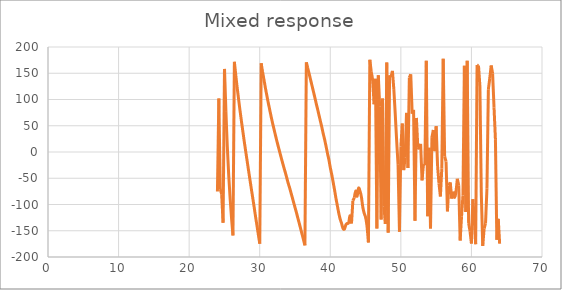
| Category | Series 1 |
|---|---|
| 24.01 | -75.169 |
| 24.20995 | 101.948 |
| 24.4099 | -70.43 |
| 24.60985 | -80.579 |
| 24.8098 | -134.649 |
| 25.00975 | 158.306 |
| 25.2097 | 77.784 |
| 25.40965 | 9.516 |
| 25.6096 | -44.796 |
| 25.80955 | -88.809 |
| 26.0095 | -126.266 |
| 26.20945 | -158.972 |
| 26.4094 | 171.735 |
| 26.60935 | 146.421 |
| 26.8093 | 122.249 |
| 27.00925 | 100.302 |
| 27.2092 | 78.877 |
| 27.40915 | 58.861 |
| 27.6091 | 39.356 |
| 27.80905 | 20.049 |
| 28.009 | 1.8 |
| 28.20895 | -16.251 |
| 28.4089 | -34.223 |
| 28.60885 | -52.158 |
| 28.808799999999998 | -69.921 |
| 29.00875 | -87.151 |
| 29.2087 | -104.777 |
| 29.40865 | -122.88 |
| 29.6086 | -140.101 |
| 29.80855 | -157.591 |
| 30.008499999999998 | -174.622 |
| 30.20845 | 169.105 |
| 30.4084 | 152.353 |
| 30.60835 | 137.323 |
| 30.8083 | 121.834 |
| 31.00825 | 107.657 |
| 31.208199999999998 | 93.957 |
| 31.40815 | 80.986 |
| 31.6081 | 68.044 |
| 31.80805 | 55.735 |
| 32.007999999999996 | 44.467 |
| 32.20795 | 33.079 |
| 32.4079 | 22.021 |
| 32.60785 | 11.641 |
| 32.8078 | 1.257 |
| 33.00775 | -8.919 |
| 33.2077 | -18.989 |
| 33.407650000000004 | -28.754 |
| 33.6076 | -38.073 |
| 33.80755 | -47.805 |
| 34.0075 | -58.156 |
| 34.20745 | -66.922 |
| 34.4074 | -76.525 |
| 34.60735 | -86.233 |
| 34.8073 | -96.168 |
| 35.00725 | -105.925 |
| 35.2072 | -115.559 |
| 35.40715 | -125.966 |
| 35.6071 | -136.059 |
| 35.807050000000004 | -146.472 |
| 36.007 | -156.874 |
| 36.20695 | -167.329 |
| 36.4069 | -177.845 |
| 36.60685 | 170.76 |
| 36.8068 | 159.918 |
| 37.00675 | 149.038 |
| 37.2067 | 137.717 |
| 37.40665 | 126.603 |
| 37.6066 | 115.363 |
| 37.80655 | 104.161 |
| 38.0065 | 92.317 |
| 38.206450000000004 | 81.318 |
| 38.4064 | 69.835 |
| 38.60635 | 58.293 |
| 38.8063 | 46.955 |
| 39.00625 | 34.525 |
| 39.2062 | 23.282 |
| 39.40615 | 10.515 |
| 39.6061 | -2.957 |
| 39.80605 | -14.964 |
| 40.006 | -30.083 |
| 40.20595 | -42.918 |
| 40.4059 | -57.417 |
| 40.605850000000004 | -72.372 |
| 40.805800000000005 | -88.347 |
| 41.00575 | -102.579 |
| 41.2057 | -116.837 |
| 41.40565 | -128.112 |
| 41.605599999999995 | -136.37 |
| 41.80555 | -145.779 |
| 42.0055 | -146.702 |
| 42.20545 | -138.711 |
| 42.4054 | -136.02 |
| 42.60535 | -134.716 |
| 42.8053 | -121.333 |
| 43.005250000000004 | -136.124 |
| 43.205200000000005 | -92.446 |
| 43.40515 | -86.969 |
| 43.6051 | -74.136 |
| 43.80505 | -84.382 |
| 44.004999999999995 | -68.787 |
| 44.20495 | -74.247 |
| 44.4049 | -85.189 |
| 44.60485 | -104.761 |
| 44.8048 | -116.702 |
| 45.00475 | -124.47 |
| 45.2047 | -141.509 |
| 45.404650000000004 | -172.284 |
| 45.604600000000005 | 175.716 |
| 45.80455 | 152.621 |
| 46.0045 | 135.643 |
| 46.20445 | 90.979 |
| 46.404399999999995 | 139.613 |
| 46.60435 | -145.886 |
| 46.8043 | 146.171 |
| 47.00425 | 87.138 |
| 47.2042 | -128.442 |
| 47.40415 | 101.741 |
| 47.6041 | -103.171 |
| 47.804050000000004 | -137.142 |
| 48.004000000000005 | 170.621 |
| 48.20395 | -153.559 |
| 48.4039 | 146.002 |
| 48.60385 | 142.311 |
| 48.803799999999995 | 154.51 |
| 49.00375 | 119.669 |
| 49.2037 | 72.466 |
| 49.40365 | 21.941 |
| 49.6036 | -24.643 |
| 49.80355 | -152.067 |
| 50.0035 | 10.258 |
| 50.203450000000004 | 54.205 |
| 50.403400000000005 | -34.576 |
| 50.60335 | -10.806 |
| 50.8033 | 74.548 |
| 51.00325 | -30.436 |
| 51.203199999999995 | 141.813 |
| 51.40315 | 148.012 |
| 51.6031 | 72.932 |
| 51.80305 | 80.249 |
| 52.003 | -130.994 |
| 52.20295 | 64.947 |
| 52.4029 | 9.583 |
| 52.602850000000004 | 5.224 |
| 52.802800000000005 | 15.433 |
| 53.00275 | -54.107 |
| 53.2027 | -23.419 |
| 53.40265 | -25.194 |
| 53.602599999999995 | 173.648 |
| 53.80255 | -122.295 |
| 54.0025 | 7.995 |
| 54.20245 | -145.853 |
| 54.4024 | 28.311 |
| 54.60235 | 42.03 |
| 54.8023 | 1.643 |
| 55.002250000000004 | 49.232 |
| 55.202200000000005 | -26.83 |
| 55.40215 | -60.003 |
| 55.6021 | -84.722 |
| 55.80205 | -31.656 |
| 56.002 | 177.691 |
| 56.20195 | -8.175 |
| 56.4019 | -18.097 |
| 56.60185 | -113.109 |
| 56.8018 | -63.636 |
| 57.00175 | -57.859 |
| 57.2017 | -88.776 |
| 57.40165 | -75.396 |
| 57.6016 | -86.596 |
| 57.80155 | -76.246 |
| 58.0015 | -50.96 |
| 58.20145 | -63.411 |
| 58.4014 | -168.692 |
| 58.60135 | -122.45 |
| 58.8013 | -82.559 |
| 59.00125 | 164.113 |
| 59.2012 | -114.223 |
| 59.40115 | 173.702 |
| 59.6011 | -135.395 |
| 59.80105 | -151.014 |
| 60.001 | -174.394 |
| 60.20095 | -89.874 |
| 60.4009 | -127.498 |
| 60.60085 | -175.518 |
| 60.8008 | 165.569 |
| 61.00075 | 164.803 |
| 61.2007 | 125.755 |
| 61.40065 | -80.062 |
| 61.6006 | -178.937 |
| 61.80055 | -145.947 |
| 62.0005 | -135.759 |
| 62.20045 | -68.982 |
| 62.4004 | 119.351 |
| 62.60035 | 140.753 |
| 62.8003 | 164.854 |
| 63.00025 | 150.025 |
| 63.2002 | 85.318 |
| 63.40015 | 24.484 |
| 63.6001 | -167.309 |
| 63.80005 | -127.286 |
| 64.0 | -174.635 |
| 64.0 | -174.635 |
| 64.0 | -174.635 |
| 64.0 | -174.635 |
| 64.0 | -174.635 |
| 64.0 | -174.635 |
| 64.0 | -174.635 |
| 64.0 | -174.635 |
| 64.0 | -174.635 |
| 64.0 | -174.635 |
| 64.0 | -174.635 |
| 64.0 | -174.635 |
| 64.0 | -174.635 |
| 64.0 | -174.635 |
| 64.0 | -174.635 |
| 64.0 | -174.635 |
| 64.0 | -174.635 |
| 64.0 | -174.635 |
| 64.0 | -174.635 |
| 64.0 | -174.635 |
| 64.0 | -174.635 |
| 64.0 | -174.635 |
| 64.0 | -174.635 |
| 64.0 | -174.635 |
| 64.0 | -174.635 |
| 64.0 | -174.635 |
| 64.0 | -174.635 |
| 64.0 | -174.635 |
| 64.0 | -174.635 |
| 64.0 | -174.635 |
| 64.0 | -174.635 |
| 64.0 | -174.635 |
| 64.0 | -174.635 |
| 64.0 | -174.635 |
| 64.0 | -174.635 |
| 64.0 | -174.635 |
| 64.0 | -174.635 |
| 64.0 | -174.635 |
| 64.0 | -174.635 |
| 64.0 | -174.635 |
| 64.0 | -174.635 |
| 64.0 | -174.635 |
| 64.0 | -174.635 |
| 64.0 | -174.635 |
| 64.0 | -174.635 |
| 64.0 | -174.635 |
| 64.0 | -174.635 |
| 64.0 | -174.635 |
| 64.0 | -174.635 |
| 64.0 | -174.635 |
| 64.0 | -174.635 |
| 64.0 | -174.635 |
| 64.0 | -174.635 |
| 64.0 | -174.635 |
| 64.0 | -174.635 |
| 64.0 | -174.635 |
| 64.0 | -174.635 |
| 64.0 | -174.635 |
| 64.0 | -174.635 |
| 64.0 | -174.635 |
| 64.0 | -174.635 |
| 64.0 | -174.635 |
| 64.0 | -174.635 |
| 64.0 | -174.635 |
| 64.0 | -174.635 |
| 64.0 | -174.635 |
| 64.0 | -174.635 |
| 64.0 | -174.635 |
| 64.0 | -174.635 |
| 64.0 | -174.635 |
| 64.0 | -174.635 |
| 64.0 | -174.635 |
| 64.0 | -174.635 |
| 64.0 | -174.635 |
| 64.0 | -174.635 |
| 64.0 | -174.635 |
| 64.0 | -174.635 |
| 64.0 | -174.635 |
| 64.0 | -174.635 |
| 64.0 | -174.635 |
| 64.0 | -174.635 |
| 64.0 | -174.635 |
| 64.0 | -174.635 |
| 64.0 | -174.635 |
| 64.0 | -174.635 |
| 64.0 | -174.635 |
| 64.0 | -174.635 |
| 64.0 | -174.635 |
| 64.0 | -174.635 |
| 64.0 | -174.635 |
| 64.0 | -174.635 |
| 64.0 | -174.635 |
| 64.0 | -174.635 |
| 64.0 | -174.635 |
| 64.0 | -174.635 |
| 64.0 | -174.635 |
| 64.0 | -174.635 |
| 64.0 | -174.635 |
| 64.0 | -174.635 |
| 64.0 | -174.635 |
| 64.0 | -174.635 |
| 64.0 | -174.635 |
| 64.0 | -174.635 |
| 64.0 | -174.635 |
| 64.0 | -174.635 |
| 64.0 | -174.635 |
| 64.0 | -174.635 |
| 64.0 | -174.635 |
| 64.0 | -174.635 |
| 64.0 | -174.635 |
| 64.0 | -174.635 |
| 64.0 | -174.635 |
| 64.0 | -174.635 |
| 64.0 | -174.635 |
| 64.0 | -174.635 |
| 64.0 | -174.635 |
| 64.0 | -174.635 |
| 64.0 | -174.635 |
| 64.0 | -174.635 |
| 64.0 | -174.635 |
| 64.0 | -174.635 |
| 64.0 | -174.635 |
| 64.0 | -174.635 |
| 64.0 | -174.635 |
| 64.0 | -174.635 |
| 64.0 | -174.635 |
| 64.0 | -174.635 |
| 64.0 | -174.635 |
| 64.0 | -174.635 |
| 64.0 | -174.635 |
| 64.0 | -174.635 |
| 64.0 | -174.635 |
| 64.0 | -174.635 |
| 64.0 | -174.635 |
| 64.0 | -174.635 |
| 64.0 | -174.635 |
| 64.0 | -174.635 |
| 64.0 | -174.635 |
| 64.0 | -174.635 |
| 64.0 | -174.635 |
| 64.0 | -174.635 |
| 64.0 | -174.635 |
| 64.0 | -174.635 |
| 64.0 | -174.635 |
| 64.0 | -174.635 |
| 64.0 | -174.635 |
| 64.0 | -174.635 |
| 64.0 | -174.635 |
| 64.0 | -174.635 |
| 64.0 | -174.635 |
| 64.0 | -174.635 |
| 64.0 | -174.635 |
| 64.0 | -174.635 |
| 64.0 | -174.635 |
| 64.0 | -174.635 |
| 64.0 | -174.635 |
| 64.0 | -174.635 |
| 64.0 | -174.635 |
| 64.0 | -174.635 |
| 64.0 | -174.635 |
| 64.0 | -174.635 |
| 64.0 | -174.635 |
| 64.0 | -174.635 |
| 64.0 | -174.635 |
| 64.0 | -174.635 |
| 64.0 | -174.635 |
| 64.0 | -174.635 |
| 64.0 | -174.635 |
| 64.0 | -174.635 |
| 64.0 | -174.635 |
| 64.0 | -174.635 |
| 64.0 | -174.635 |
| 64.0 | -174.635 |
| 64.0 | -174.635 |
| 64.0 | -174.635 |
| 64.0 | -174.635 |
| 64.0 | -174.635 |
| 64.0 | -174.635 |
| 64.0 | -174.635 |
| 64.0 | -174.635 |
| 64.0 | -174.635 |
| 64.0 | -174.635 |
| 64.0 | -174.635 |
| 64.0 | -174.635 |
| 64.0 | -174.635 |
| 64.0 | -174.635 |
| 64.0 | -174.635 |
| 64.0 | -174.635 |
| 64.0 | -174.635 |
| 64.0 | -174.635 |
| 64.0 | -174.635 |
| 64.0 | -174.635 |
| 64.0 | -174.635 |
| 64.0 | -174.635 |
| 64.0 | -174.635 |
| 64.0 | -174.635 |
| 64.0 | -174.635 |
| 64.0 | -174.635 |
| 64.0 | -174.635 |
| 64.0 | -174.635 |
| 64.0 | -174.635 |
| 64.0 | -174.635 |
| 64.0 | -174.635 |
| 64.0 | -174.635 |
| 64.0 | -174.635 |
| 64.0 | -174.635 |
| 64.0 | -174.635 |
| 64.0 | -174.635 |
| 64.0 | -174.635 |
| 64.0 | -174.635 |
| 64.0 | -174.635 |
| 64.0 | -174.635 |
| 64.0 | -174.635 |
| 64.0 | -174.635 |
| 64.0 | -174.635 |
| 64.0 | -174.635 |
| 64.0 | -174.635 |
| 64.0 | -174.635 |
| 64.0 | -174.635 |
| 64.0 | -174.635 |
| 64.0 | -174.635 |
| 64.0 | -174.635 |
| 64.0 | -174.635 |
| 64.0 | -174.635 |
| 64.0 | -174.635 |
| 64.0 | -174.635 |
| 64.0 | -174.635 |
| 64.0 | -174.635 |
| 64.0 | -174.635 |
| 64.0 | -174.635 |
| 64.0 | -174.635 |
| 64.0 | -174.635 |
| 64.0 | -174.635 |
| 64.0 | -174.635 |
| 64.0 | -174.635 |
| 64.0 | -174.635 |
| 64.0 | -174.635 |
| 64.0 | -174.635 |
| 64.0 | -174.635 |
| 64.0 | -174.635 |
| 64.0 | -174.635 |
| 64.0 | -174.635 |
| 64.0 | -174.635 |
| 64.0 | -174.635 |
| 64.0 | -174.635 |
| 64.0 | -174.635 |
| 64.0 | -174.635 |
| 64.0 | -174.635 |
| 64.0 | -174.635 |
| 64.0 | -174.635 |
| 64.0 | -174.635 |
| 64.0 | -174.635 |
| 64.0 | -174.635 |
| 64.0 | -174.635 |
| 64.0 | -174.635 |
| 64.0 | -174.635 |
| 64.0 | -174.635 |
| 64.0 | -174.635 |
| 64.0 | -174.635 |
| 64.0 | -174.635 |
| 64.0 | -174.635 |
| 64.0 | -174.635 |
| 64.0 | -174.635 |
| 64.0 | -174.635 |
| 64.0 | -174.635 |
| 64.0 | -174.635 |
| 64.0 | -174.635 |
| 64.0 | -174.635 |
| 64.0 | -174.635 |
| 64.0 | -174.635 |
| 64.0 | -174.635 |
| 64.0 | -174.635 |
| 64.0 | -174.635 |
| 64.0 | -174.635 |
| 64.0 | -174.635 |
| 64.0 | -174.635 |
| 64.0 | -174.635 |
| 64.0 | -174.635 |
| 64.0 | -174.635 |
| 64.0 | -174.635 |
| 64.0 | -174.635 |
| 64.0 | -174.635 |
| 64.0 | -174.635 |
| 64.0 | -174.635 |
| 64.0 | -174.635 |
| 64.0 | -174.635 |
| 64.0 | -174.635 |
| 64.0 | -174.635 |
| 64.0 | -174.635 |
| 64.0 | -174.635 |
| 64.0 | -174.635 |
| 64.0 | -174.635 |
| 64.0 | -174.635 |
| 64.0 | -174.635 |
| 64.0 | -174.635 |
| 64.0 | -174.635 |
| 64.0 | -174.635 |
| 64.0 | -174.635 |
| 64.0 | -174.635 |
| 64.0 | -174.635 |
| 64.0 | -174.635 |
| 64.0 | -174.635 |
| 64.0 | -174.635 |
| 64.0 | -174.635 |
| 64.0 | -174.635 |
| 64.0 | -174.635 |
| 64.0 | -174.635 |
| 64.0 | -174.635 |
| 64.0 | -174.635 |
| 64.0 | -174.635 |
| 64.0 | -174.635 |
| 64.0 | -174.635 |
| 64.0 | -174.635 |
| 64.0 | -174.635 |
| 64.0 | -174.635 |
| 64.0 | -174.635 |
| 64.0 | -174.635 |
| 64.0 | -174.635 |
| 64.0 | -174.635 |
| 64.0 | -174.635 |
| 64.0 | -174.635 |
| 64.0 | -174.635 |
| 64.0 | -174.635 |
| 64.0 | -174.635 |
| 64.0 | -174.635 |
| 64.0 | -174.635 |
| 64.0 | -174.635 |
| 64.0 | -174.635 |
| 64.0 | -174.635 |
| 64.0 | -174.635 |
| 64.0 | -174.635 |
| 64.0 | -174.635 |
| 64.0 | -174.635 |
| 64.0 | -174.635 |
| 64.0 | -174.635 |
| 64.0 | -174.635 |
| 64.0 | -174.635 |
| 64.0 | -174.635 |
| 64.0 | -174.635 |
| 64.0 | -174.635 |
| 64.0 | -174.635 |
| 64.0 | -174.635 |
| 64.0 | -174.635 |
| 64.0 | -174.635 |
| 64.0 | -174.635 |
| 64.0 | -174.635 |
| 64.0 | -174.635 |
| 64.0 | -174.635 |
| 64.0 | -174.635 |
| 64.0 | -174.635 |
| 64.0 | -174.635 |
| 64.0 | -174.635 |
| 64.0 | -174.635 |
| 64.0 | -174.635 |
| 64.0 | -174.635 |
| 64.0 | -174.635 |
| 64.0 | -174.635 |
| 64.0 | -174.635 |
| 64.0 | -174.635 |
| 64.0 | -174.635 |
| 64.0 | -174.635 |
| 64.0 | -174.635 |
| 64.0 | -174.635 |
| 64.0 | -174.635 |
| 64.0 | -174.635 |
| 64.0 | -174.635 |
| 64.0 | -174.635 |
| 64.0 | -174.635 |
| 64.0 | -174.635 |
| 64.0 | -174.635 |
| 64.0 | -174.635 |
| 64.0 | -174.635 |
| 64.0 | -174.635 |
| 64.0 | -174.635 |
| 64.0 | -174.635 |
| 64.0 | -174.635 |
| 64.0 | -174.635 |
| 64.0 | -174.635 |
| 64.0 | -174.635 |
| 64.0 | -174.635 |
| 64.0 | -174.635 |
| 64.0 | -174.635 |
| 64.0 | -174.635 |
| 64.0 | -174.635 |
| 64.0 | -174.635 |
| 64.0 | -174.635 |
| 64.0 | -174.635 |
| 64.0 | -174.635 |
| 64.0 | -174.635 |
| 64.0 | -174.635 |
| 64.0 | -174.635 |
| 64.0 | -174.635 |
| 64.0 | -174.635 |
| 64.0 | -174.635 |
| 64.0 | -174.635 |
| 64.0 | -174.635 |
| 64.0 | -174.635 |
| 64.0 | -174.635 |
| 64.0 | -174.635 |
| 64.0 | -174.635 |
| 64.0 | -174.635 |
| 64.0 | -174.635 |
| 64.0 | -174.635 |
| 64.0 | -174.635 |
| 64.0 | -174.635 |
| 64.0 | -174.635 |
| 64.0 | -174.635 |
| 64.0 | -174.635 |
| 64.0 | -174.635 |
| 64.0 | -174.635 |
| 64.0 | -174.635 |
| 64.0 | -174.635 |
| 64.0 | -174.635 |
| 64.0 | -174.635 |
| 64.0 | -174.635 |
| 64.0 | -174.635 |
| 64.0 | -174.635 |
| 64.0 | -174.635 |
| 64.0 | -174.635 |
| 64.0 | -174.635 |
| 64.0 | -174.635 |
| 64.0 | -174.635 |
| 64.0 | -174.635 |
| 64.0 | -174.635 |
| 64.0 | -174.635 |
| 64.0 | -174.635 |
| 64.0 | -174.635 |
| 64.0 | -174.635 |
| 64.0 | -174.635 |
| 64.0 | -174.635 |
| 64.0 | -174.635 |
| 64.0 | -174.635 |
| 64.0 | -174.635 |
| 64.0 | -174.635 |
| 64.0 | -174.635 |
| 64.0 | -174.635 |
| 64.0 | -174.635 |
| 64.0 | -174.635 |
| 64.0 | -174.635 |
| 64.0 | -174.635 |
| 64.0 | -174.635 |
| 64.0 | -174.635 |
| 64.0 | -174.635 |
| 64.0 | -174.635 |
| 64.0 | -174.635 |
| 64.0 | -174.635 |
| 64.0 | -174.635 |
| 64.0 | -174.635 |
| 64.0 | -174.635 |
| 64.0 | -174.635 |
| 64.0 | -174.635 |
| 64.0 | -174.635 |
| 64.0 | -174.635 |
| 64.0 | -174.635 |
| 64.0 | -174.635 |
| 64.0 | -174.635 |
| 64.0 | -174.635 |
| 64.0 | -174.635 |
| 64.0 | -174.635 |
| 64.0 | -174.635 |
| 64.0 | -174.635 |
| 64.0 | -174.635 |
| 64.0 | -174.635 |
| 64.0 | -174.635 |
| 64.0 | -174.635 |
| 64.0 | -174.635 |
| 64.0 | -174.635 |
| 64.0 | -174.635 |
| 64.0 | -174.635 |
| 64.0 | -174.635 |
| 64.0 | -174.635 |
| 64.0 | -174.635 |
| 64.0 | -174.635 |
| 64.0 | -174.635 |
| 64.0 | -174.635 |
| 64.0 | -174.635 |
| 64.0 | -174.635 |
| 64.0 | -174.635 |
| 64.0 | -174.635 |
| 64.0 | -174.635 |
| 64.0 | -174.635 |
| 64.0 | -174.635 |
| 64.0 | -174.635 |
| 64.0 | -174.635 |
| 64.0 | -174.635 |
| 64.0 | -174.635 |
| 64.0 | -174.635 |
| 64.0 | -174.635 |
| 64.0 | -174.635 |
| 64.0 | -174.635 |
| 64.0 | -174.635 |
| 64.0 | -174.635 |
| 64.0 | -174.635 |
| 64.0 | -174.635 |
| 64.0 | -174.635 |
| 64.0 | -174.635 |
| 64.0 | -174.635 |
| 64.0 | -174.635 |
| 64.0 | -174.635 |
| 64.0 | -174.635 |
| 64.0 | -174.635 |
| 64.0 | -174.635 |
| 64.0 | -174.635 |
| 64.0 | -174.635 |
| 64.0 | -174.635 |
| 64.0 | -174.635 |
| 64.0 | -174.635 |
| 64.0 | -174.635 |
| 64.0 | -174.635 |
| 64.0 | -174.635 |
| 64.0 | -174.635 |
| 64.0 | -174.635 |
| 64.0 | -174.635 |
| 64.0 | -174.635 |
| 64.0 | -174.635 |
| 64.0 | -174.635 |
| 64.0 | -174.635 |
| 64.0 | -174.635 |
| 64.0 | -174.635 |
| 64.0 | -174.635 |
| 64.0 | -174.635 |
| 64.0 | -174.635 |
| 64.0 | -174.635 |
| 64.0 | -174.635 |
| 64.0 | -174.635 |
| 64.0 | -174.635 |
| 64.0 | -174.635 |
| 64.0 | -174.635 |
| 64.0 | -174.635 |
| 64.0 | -174.635 |
| 64.0 | -174.635 |
| 64.0 | -174.635 |
| 64.0 | -174.635 |
| 64.0 | -174.635 |
| 64.0 | -174.635 |
| 64.0 | -174.635 |
| 64.0 | -174.635 |
| 64.0 | -174.635 |
| 64.0 | -174.635 |
| 64.0 | -174.635 |
| 64.0 | -174.635 |
| 64.0 | -174.635 |
| 64.0 | -174.635 |
| 64.0 | -174.635 |
| 64.0 | -174.635 |
| 64.0 | -174.635 |
| 64.0 | -174.635 |
| 64.0 | -174.635 |
| 64.0 | -174.635 |
| 64.0 | -174.635 |
| 64.0 | -174.635 |
| 64.0 | -174.635 |
| 64.0 | -174.635 |
| 64.0 | -174.635 |
| 64.0 | -174.635 |
| 64.0 | -174.635 |
| 64.0 | -174.635 |
| 64.0 | -174.635 |
| 64.0 | -174.635 |
| 64.0 | -174.635 |
| 64.0 | -174.635 |
| 64.0 | -174.635 |
| 64.0 | -174.635 |
| 64.0 | -174.635 |
| 64.0 | -174.635 |
| 64.0 | -174.635 |
| 64.0 | -174.635 |
| 64.0 | -174.635 |
| 64.0 | -174.635 |
| 64.0 | -174.635 |
| 64.0 | -174.635 |
| 64.0 | -174.635 |
| 64.0 | -174.635 |
| 64.0 | -174.635 |
| 64.0 | -174.635 |
| 64.0 | -174.635 |
| 64.0 | -174.635 |
| 64.0 | -174.635 |
| 64.0 | -174.635 |
| 64.0 | -174.635 |
| 64.0 | -174.635 |
| 64.0 | -174.635 |
| 64.0 | -174.635 |
| 64.0 | -174.635 |
| 64.0 | -174.635 |
| 64.0 | -174.635 |
| 64.0 | -174.635 |
| 64.0 | -174.635 |
| 64.0 | -174.635 |
| 64.0 | -174.635 |
| 64.0 | -174.635 |
| 64.0 | -174.635 |
| 64.0 | -174.635 |
| 64.0 | -174.635 |
| 64.0 | -174.635 |
| 64.0 | -174.635 |
| 64.0 | -174.635 |
| 64.0 | -174.635 |
| 64.0 | -174.635 |
| 64.0 | -174.635 |
| 64.0 | -174.635 |
| 64.0 | -174.635 |
| 64.0 | -174.635 |
| 64.0 | -174.635 |
| 64.0 | -174.635 |
| 64.0 | -174.635 |
| 64.0 | -174.635 |
| 64.0 | -174.635 |
| 64.0 | -174.635 |
| 64.0 | -174.635 |
| 64.0 | -174.635 |
| 64.0 | -174.635 |
| 64.0 | -174.635 |
| 64.0 | -174.635 |
| 64.0 | -174.635 |
| 64.0 | -174.635 |
| 64.0 | -174.635 |
| 64.0 | -174.635 |
| 64.0 | -174.635 |
| 64.0 | -174.635 |
| 64.0 | -174.635 |
| 64.0 | -174.635 |
| 64.0 | -174.635 |
| 64.0 | -174.635 |
| 64.0 | -174.635 |
| 64.0 | -174.635 |
| 64.0 | -174.635 |
| 64.0 | -174.635 |
| 64.0 | -174.635 |
| 64.0 | -174.635 |
| 64.0 | -174.635 |
| 64.0 | -174.635 |
| 64.0 | -174.635 |
| 64.0 | -174.635 |
| 64.0 | -174.635 |
| 64.0 | -174.635 |
| 64.0 | -174.635 |
| 64.0 | -174.635 |
| 64.0 | -174.635 |
| 64.0 | -174.635 |
| 64.0 | -174.635 |
| 64.0 | -174.635 |
| 64.0 | -174.635 |
| 64.0 | -174.635 |
| 64.0 | -174.635 |
| 64.0 | -174.635 |
| 64.0 | -174.635 |
| 64.0 | -174.635 |
| 64.0 | -174.635 |
| 64.0 | -174.635 |
| 64.0 | -174.635 |
| 64.0 | -174.635 |
| 64.0 | -174.635 |
| 64.0 | -174.635 |
| 64.0 | -174.635 |
| 64.0 | -174.635 |
| 64.0 | -174.635 |
| 64.0 | -174.635 |
| 64.0 | -174.635 |
| 64.0 | -174.635 |
| 64.0 | -174.635 |
| 64.0 | -174.635 |
| 64.0 | -174.635 |
| 64.0 | -174.635 |
| 64.0 | -174.635 |
| 64.0 | -174.635 |
| 64.0 | -174.635 |
| 64.0 | -174.635 |
| 64.0 | -174.635 |
| 64.0 | -174.635 |
| 64.0 | -174.635 |
| 64.0 | -174.635 |
| 64.0 | -174.635 |
| 64.0 | -174.635 |
| 64.0 | -174.635 |
| 64.0 | -174.635 |
| 64.0 | -174.635 |
| 64.0 | -174.635 |
| 64.0 | -174.635 |
| 64.0 | -174.635 |
| 64.0 | -174.635 |
| 64.0 | -174.635 |
| 64.0 | -174.635 |
| 64.0 | -174.635 |
| 64.0 | -174.635 |
| 64.0 | -174.635 |
| 64.0 | -174.635 |
| 64.0 | -174.635 |
| 64.0 | -174.635 |
| 64.0 | -174.635 |
| 64.0 | -174.635 |
| 64.0 | -174.635 |
| 64.0 | -174.635 |
| 64.0 | -174.635 |
| 64.0 | -174.635 |
| 64.0 | -174.635 |
| 64.0 | -174.635 |
| 64.0 | -174.635 |
| 64.0 | -174.635 |
| 64.0 | -174.635 |
| 64.0 | -174.635 |
| 64.0 | -174.635 |
| 64.0 | -174.635 |
| 64.0 | -174.635 |
| 64.0 | -174.635 |
| 64.0 | -174.635 |
| 64.0 | -174.635 |
| 64.0 | -174.635 |
| 64.0 | -174.635 |
| 64.0 | -174.635 |
| 64.0 | -174.635 |
| 64.0 | -174.635 |
| 64.0 | -174.635 |
| 64.0 | -174.635 |
| 64.0 | -174.635 |
| 64.0 | -174.635 |
| 64.0 | -174.635 |
| 64.0 | -174.635 |
| 64.0 | -174.635 |
| 64.0 | -174.635 |
| 64.0 | -174.635 |
| 64.0 | -174.635 |
| 64.0 | -174.635 |
| 64.0 | -174.635 |
| 64.0 | -174.635 |
| 64.0 | -174.635 |
| 64.0 | -174.635 |
| 64.0 | -174.635 |
| 64.0 | -174.635 |
| 64.0 | -174.635 |
| 64.0 | -174.635 |
| 64.0 | -174.635 |
| 64.0 | -174.635 |
| 64.0 | -174.635 |
| 64.0 | -174.635 |
| 64.0 | -174.635 |
| 64.0 | -174.635 |
| 64.0 | -174.635 |
| 64.0 | -174.635 |
| 64.0 | -174.635 |
| 64.0 | -174.635 |
| 64.0 | -174.635 |
| 64.0 | -174.635 |
| 64.0 | -174.635 |
| 64.0 | -174.635 |
| 64.0 | -174.635 |
| 64.0 | -174.635 |
| 64.0 | -174.635 |
| 64.0 | -174.635 |
| 64.0 | -174.635 |
| 64.0 | -174.635 |
| 64.0 | -174.635 |
| 64.0 | -174.635 |
| 64.0 | -174.635 |
| 64.0 | -174.635 |
| 64.0 | -174.635 |
| 64.0 | -174.635 |
| 64.0 | -174.635 |
| 64.0 | -174.635 |
| 64.0 | -174.635 |
| 64.0 | -174.635 |
| 64.0 | -174.635 |
| 64.0 | -174.635 |
| 64.0 | -174.635 |
| 64.0 | -174.635 |
| 64.0 | -174.635 |
| 64.0 | -174.635 |
| 64.0 | -174.635 |
| 64.0 | -174.635 |
| 64.0 | -174.635 |
| 64.0 | -174.635 |
| 64.0 | -174.635 |
| 64.0 | -174.635 |
| 64.0 | -174.635 |
| 64.0 | -174.635 |
| 64.0 | -174.635 |
| 64.0 | -174.635 |
| 64.0 | -174.635 |
| 64.0 | -174.635 |
| 64.0 | -174.635 |
| 64.0 | -174.635 |
| 64.0 | -174.635 |
| 64.0 | -174.635 |
| 64.0 | -174.635 |
| 64.0 | -174.635 |
| 64.0 | -174.635 |
| 64.0 | -174.635 |
| 64.0 | -174.635 |
| 64.0 | -174.635 |
| 64.0 | -174.635 |
| 64.0 | -174.635 |
| 64.0 | -174.635 |
| 64.0 | -174.635 |
| 64.0 | -174.635 |
| 64.0 | -174.635 |
| 64.0 | -174.635 |
| 64.0 | -174.635 |
| 64.0 | -174.635 |
| 64.0 | -174.635 |
| 64.0 | -174.635 |
| 64.0 | -174.635 |
| 64.0 | -174.635 |